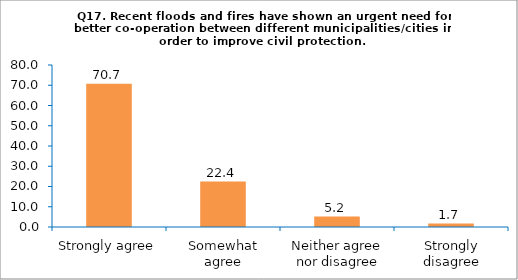
| Category | Series 0 |
|---|---|
| Strongly agree | 70.69 |
| Somewhat agree | 22.414 |
| Neither agree nor disagree | 5.172 |
| Strongly disagree | 1.724 |